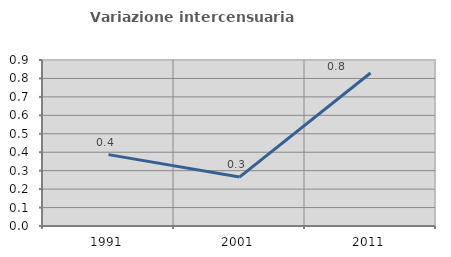
| Category | Variazione intercensuaria annua |
|---|---|
| 1991.0 | 0.387 |
| 2001.0 | 0.265 |
| 2011.0 | 0.829 |